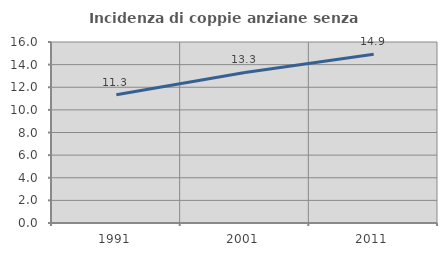
| Category | Incidenza di coppie anziane senza figli  |
|---|---|
| 1991.0 | 11.336 |
| 2001.0 | 13.308 |
| 2011.0 | 14.92 |